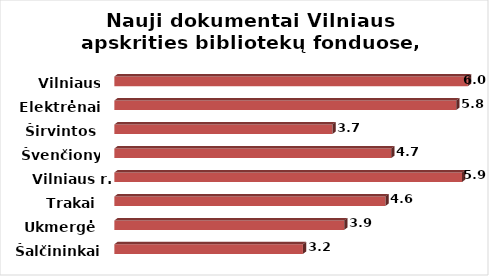
| Category | Series 0 |
|---|---|
| Šalčininkai | 3.2 |
| Ukmergė | 3.9 |
| Trakai | 4.6 |
| Vilniaus r. | 5.9 |
| Švenčionys | 4.7 |
| Širvintos | 3.7 |
| Elektrėnai | 5.8 |
| Vilniaus m. | 6 |